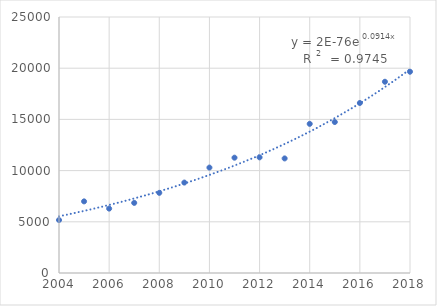
| Category | NOTICIAS |
|---|---|
| 2004.0 | 5170 |
| 2005.0 | 6994 |
| 2006.0 | 6289 |
| 2007.0 | 6847 |
| 2008.0 | 7827 |
| 2009.0 | 8831 |
| 2010.0 | 10295 |
| 2011.0 | 11261 |
| 2012.0 | 11294 |
| 2013.0 | 11189 |
| 2014.0 | 14563 |
| 2015.0 | 14744 |
| 2016.0 | 16602 |
| 2017.0 | 18676 |
| 2018.0 | 19656 |